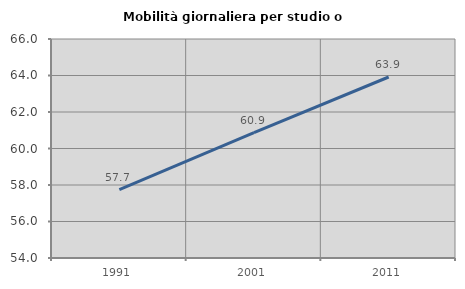
| Category | Mobilità giornaliera per studio o lavoro |
|---|---|
| 1991.0 | 57.742 |
| 2001.0 | 60.868 |
| 2011.0 | 63.918 |